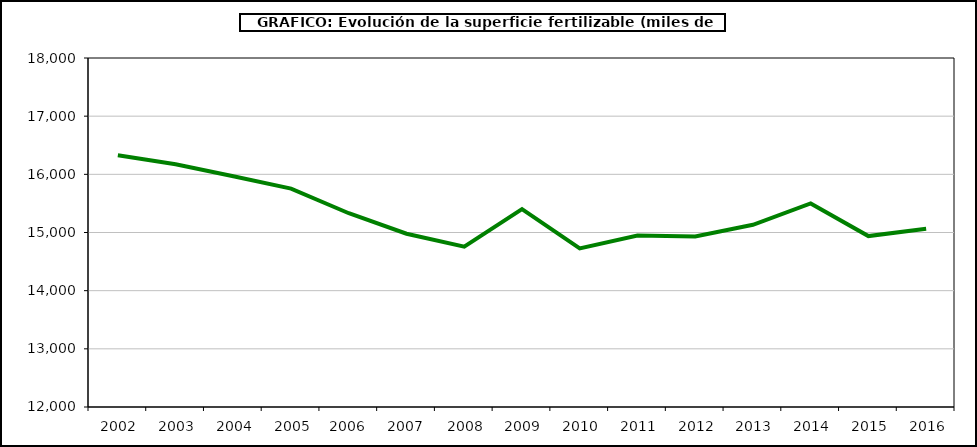
| Category | fertilizantes |
|---|---|
|   2002 | 16328 |
|   2003 | 16174 |
|   2004 | 15965.705 |
|   2005 | 15754.807 |
|   2006  | 15331.413 |
|   2007  | 14979.076 |
|   2008 | 14757 |
|   2009 | 15402 |
|   2010 | 14727 |
|   2011 | 14947 |
|   2012 | 14932 |
|   2013 | 15133 |
|   2014 | 15499 |
|   2015 | 14938 |
|   2016 | 15065 |